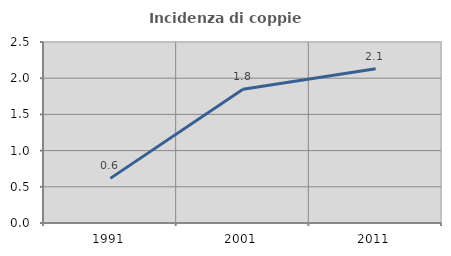
| Category | Incidenza di coppie miste |
|---|---|
| 1991.0 | 0.616 |
| 2001.0 | 1.847 |
| 2011.0 | 2.13 |